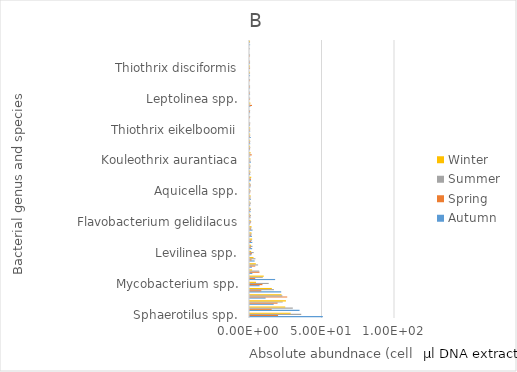
| Category | Autumn | Spring | Summer | Winter |
|---|---|---|---|---|
| Sphaerotilus spp. | 50.24 | 19.345 | 35.326 | 28.054 |
| Lewinella spp. | 34.157 | 14.915 | 29.528 | 24.306 |
| Tetrasphaera spp. | 16.329 | 19.007 | 22.559 | 24.789 |
| Lewinella sp. | 10.757 | 25.664 | 22.32 | 21.761 |
| Bellilinea spp. | 21.512 | 7.811 | 16.505 | 15.054 |
| Mycobacterium spp. | 6.6 | 8.578 | 12.887 | 4.148 |
| Haliscomenobacter spp. | 17.331 | 3.597 | 8.808 | 9.493 |
| Candidatus monilibacter batavus | 1.64 | 6.535 | 6.349 | 1.486 |
| Candidatus microthrix parvicella | 1.317 | 3.632 | 5.563 | 4.011 |
| Crocinitomix spp. | 3.204 | 1.093 | 3.745 | 2.422 |
| Levilinea spp. | 0.919 | 1.357 | 2.575 | 0.825 |
| Haliscomenobacter sp. | 1.509 | 0.486 | 1.709 | 0.756 |
| Haliscomenobacter hydrossis | 1.607 | 0.743 | 1.297 | 1.517 |
| Clostridium perfringens | 1.379 | 0.732 | 1.216 | 0.971 |
| Fluviicola spp. | 1.718 | 0.702 | 0.982 | 1.055 |
| Flavobacterium gelidilacus | 0.073 | 0.564 | 0.833 | 0.384 |
| Anaerolinea spp. | 0.362 | 0.232 | 0.622 | 0.125 |
| Tetrasphaera jenkinsii | 0.364 | 0.128 | 0.621 | 0.299 |
| Levilinea saccharolytica | 0.139 | 0.163 | 0.601 | 0.109 |
| Candidatus alysiosphaera europeae | 0.68 | 0.192 | 0.496 | 0.366 |
| Aquicella spp. | 0.047 | 0.226 | 0.491 | 0.015 |
| Longilinea spp. | 0.277 | 0.457 | 0.46 | 0.143 |
| Tetrasphaera sp. | 0.477 | 0.581 | 0.454 | 0.855 |
| Uncultured candidatus microthrix sp. | 0.165 | 0.053 | 0.395 | 0.155 |
| Beggiatoa sp. | 0.102 | 0.115 | 0.373 | 0.122 |
| Kouleothrix aurantiaca | 0.607 | 0.194 | 0.286 | 0.324 |
| Acinetobacter johnsonii | 0.164 | 1.211 | 0.202 | 0.347 |
| Leptolinea tardivitalis | 0.021 | 0.05 | 0.202 | 0.054 |
| Crenothrix polyspora | 0.116 | 0.022 | 0.19 | 0.046 |
| Anaerolinea thermolimosa | 0.517 | 0.044 | 0.158 | 0.084 |
| Thiothrix eikelboomii | 0.131 | 0.034 | 0.15 | 0.082 |
| Kouleothrix spp. | 0.02 | 0.069 | 0.149 | 0 |
| Gordonia paraffinivorans | 0 | 0.018 | 0.088 | 0 |
| Thiothrix sp. | 0.037 | 0.012 | 0.084 | 0 |
| Aquicella lusitana | 0.251 | 1.391 | 0.083 | 0.266 |
| Leptolinea spp. | 0 | 0.041 | 0.074 | 0 |
| Thiothrix spp. | 0.047 | 0.008 | 0.054 | 0 |
| Tetrasphaera vanveenii | 0.038 | 0.013 | 0.041 | 0 |
| Flavobacterium succinicans | 0 | 0.009 | 0.027 | 0 |
| Bellilinea caldifistulae | 0.026 | 0 | 0.023 | 0.029 |
| Thiothrix disciformis | 0 | 0.026 | 0.022 | 0.015 |
| Tetrasphaera australiensis | 0.025 | 0.013 | 0.019 | 0 |
| Thiothrix fructosivorans | 0 | 0.007 | 0.018 | 0 |
| Candidatus microthrix calida | 0 | 0 | 0.009 | 0 |
| Beggiatoa spp. | 0.071 | 0 | 0.005 | 0.018 |